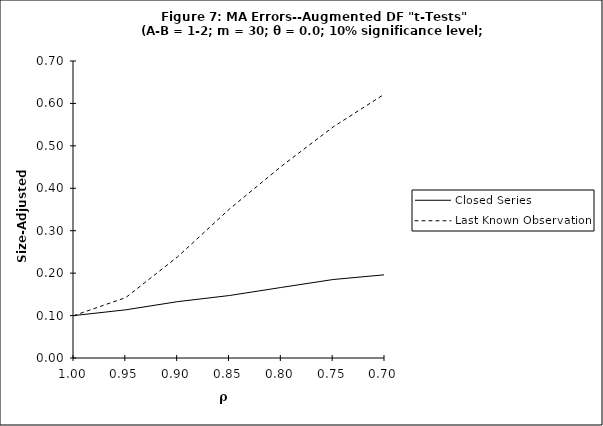
| Category | Closed Series | Last Known Observation |
|---|---|---|
| 1.0 | 0.1 | 0.1 |
| 0.95 | 0.114 | 0.142 |
| 0.9 | 0.133 | 0.239 |
| 0.85 | 0.147 | 0.351 |
| 0.8 | 0.166 | 0.452 |
| 0.75 | 0.185 | 0.545 |
| 0.7 | 0.196 | 0.623 |